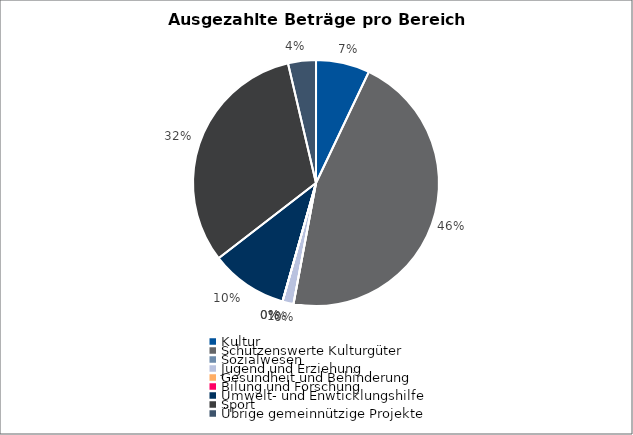
| Category | Series 0 |
|---|---|
| Kultur | 2536163 |
| Schützenswerte Kulturgüter | 16467503 |
| Sozialwesen | 0 |
| Jugend und Erziehung | 520855 |
| Gesundheit und Behinderung | 0 |
| Bilung und Forschung | 0 |
| Umwelt- und Enwticklungshilfe | 3641780 |
| Sport | 11421330 |
| Übrige gemeinnützige Projekte | 1317120 |